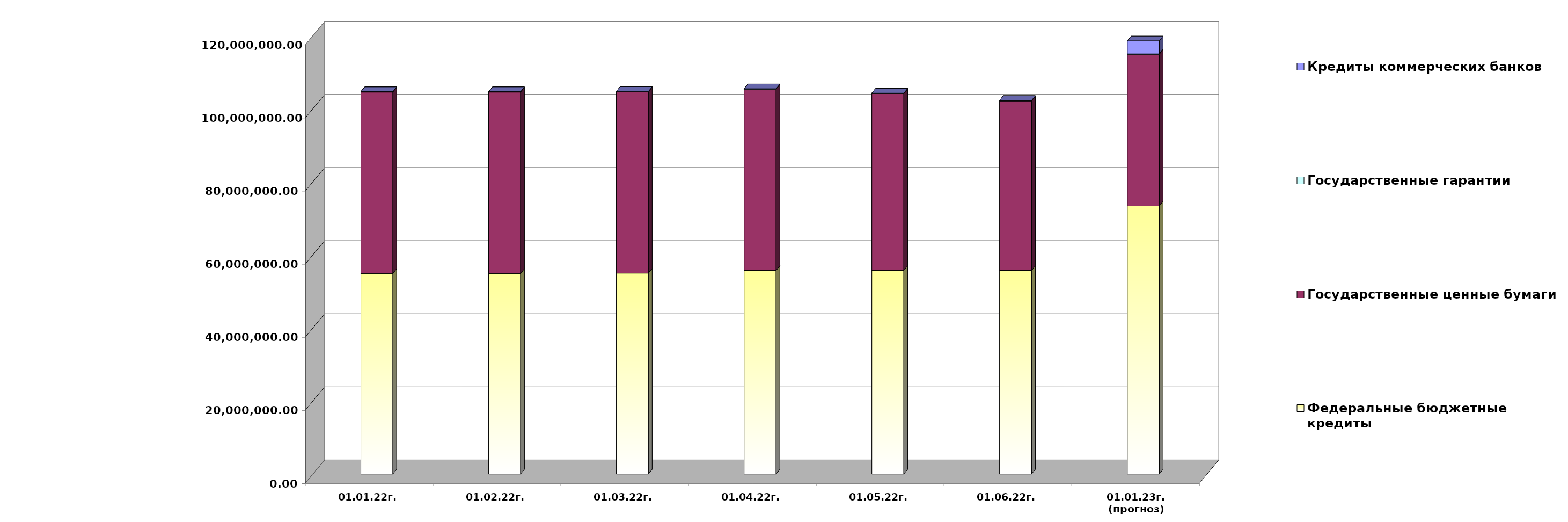
| Category | Федеральные бюджетные кредиты | Государственные ценные бумаги  | Государственные гарантии | Кредиты коммерческих банков |
|---|---|---|---|---|
| 01.01.22г. | 54900618.713 | 49600000 | 141570.67 | 0 |
| 01.02.22г. | 54900618.713 | 49600000 | 139748.87 | 0 |
| 01.03.22г. | 54970753.113 | 49600000 | 139748.87 | 0 |
| 01.04.22г. | 55700753.113 | 49600000 | 139748.87 | 0 |
| 01.05.22г. | 55700753.113 | 48400000 | 138270.964 | 0 |
| 01.06.22г. | 55705077.413 | 46400000 | 138270.964 | 0 |
| 01.01.23г.
(прогноз) | 73354281.8 | 41500000 | 129957.7 | 3569507.7 |